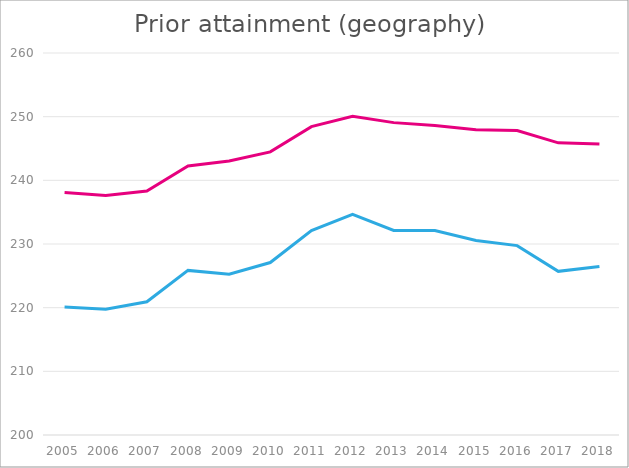
| Category | Mean points score, geography | Mean points score, best 3 |
|---|---|---|
| 2005.0 | 238.079 | 220.091 |
| 2006.0 | 237.615 | 219.766 |
| 2007.0 | 238.328 | 220.92 |
| 2008.0 | 242.255 | 225.855 |
| 2009.0 | 243.023 | 225.246 |
| 2010.0 | 244.467 | 227.09 |
| 2011.0 | 248.43 | 232.122 |
| 2012.0 | 250.071 | 234.651 |
| 2013.0 | 249.065 | 232.136 |
| 2014.0 | 248.607 | 232.13 |
| 2015.0 | 247.958 | 230.556 |
| 2016.0 | 247.834 | 229.746 |
| 2017.0 | 245.884 | 225.703 |
| 2018.0 | 245.71 | 226.463 |